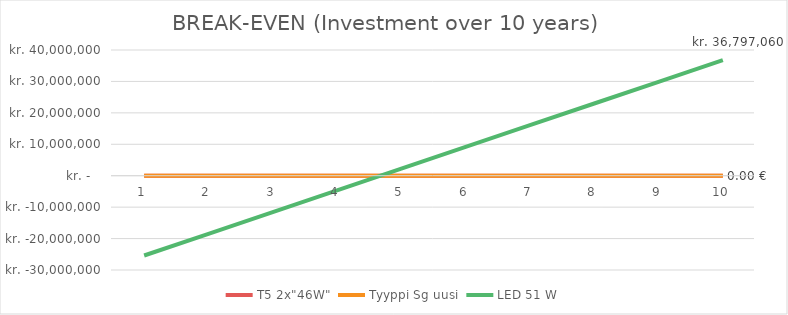
| Category | T5 2x"46W" | Tyyppi Sg uusi | 19W Rax (on/off) | LED 51 W |
|---|---|---|---|---|
| 0 | 0 | 0 |  | -25386099.082 |
| 1 | 0 | 0 |  | -18476859.165 |
| 2 | 0 | 0 |  | -11567619.247 |
| 3 | 0 | 0 |  | -4658379.33 |
| 4 | 0 | 0 |  | 2250860.588 |
| 5 | 0 | 0 |  | 9160100.506 |
| 6 | 0 | 0 |  | 16069340.423 |
| 7 | 0 | 0 |  | 22978580.341 |
| 8 | 0 | 0 |  | 29887820.259 |
| 9 | 0 | 0 |  | 36797060.176 |